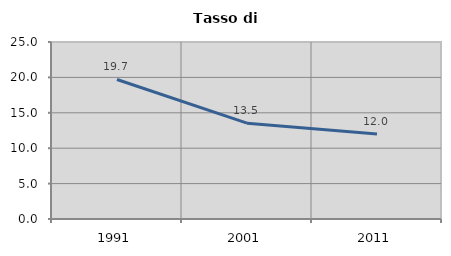
| Category | Tasso di disoccupazione   |
|---|---|
| 1991.0 | 19.706 |
| 2001.0 | 13.541 |
| 2011.0 | 11.993 |